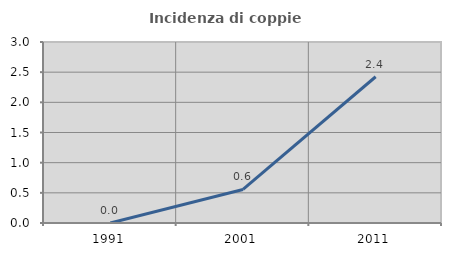
| Category | Incidenza di coppie miste |
|---|---|
| 1991.0 | 0 |
| 2001.0 | 0.556 |
| 2011.0 | 2.424 |